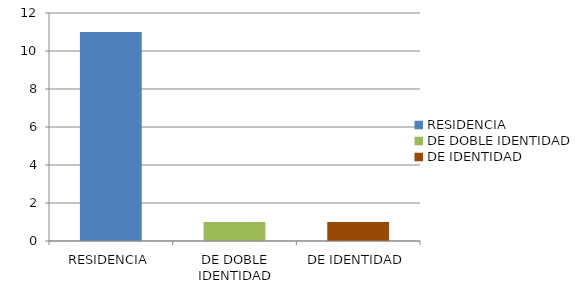
| Category | Series 0 |
|---|---|
| RESIDENCIA | 11 |
| DE DOBLE IDENTIDAD | 1 |
| DE IDENTIDAD | 1 |